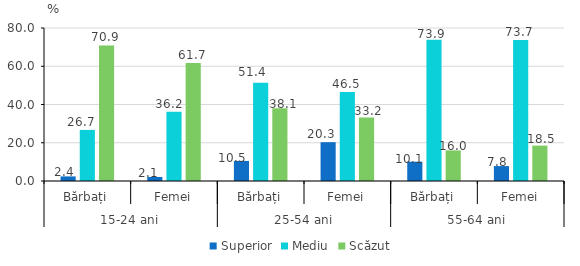
| Category | Superior | Mediu | Scăzut |
|---|---|---|---|
| 0 | 2.4 | 26.7 | 70.9 |
| 1 | 2.1 | 36.2 | 61.7 |
| 2 | 10.5 | 51.4 | 38.1 |
| 3 | 20.3 | 46.5 | 33.2 |
| 4 | 10.1 | 73.9 | 16 |
| 5 | 7.8 | 73.7 | 18.5 |